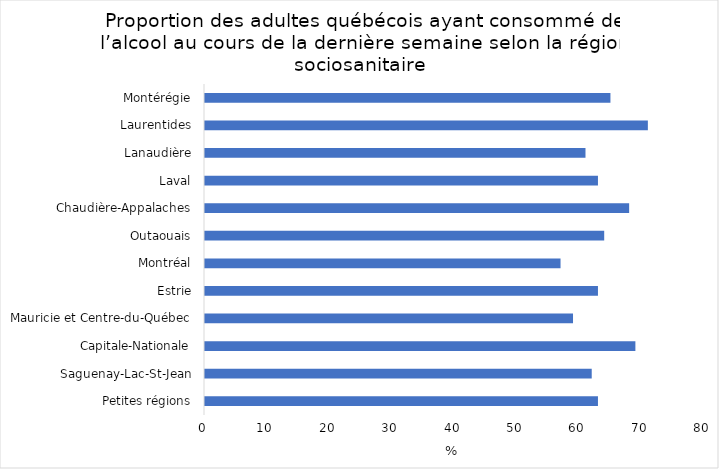
| Category | Series 0 |
|---|---|
| Petites régions | 63 |
| Saguenay-Lac-St-Jean | 62 |
| Capitale-Nationale | 69 |
| Mauricie et Centre-du-Québec | 59 |
| Estrie | 63 |
| Montréal | 57 |
| Outaouais | 64 |
| Chaudière-Appalaches | 68 |
| Laval | 63 |
| Lanaudière | 61 |
| Laurentides | 71 |
| Montérégie | 65 |